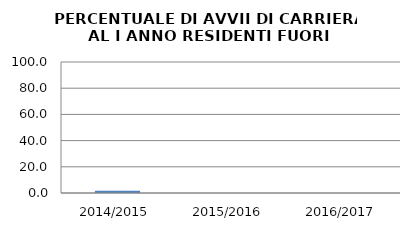
| Category | 2014/2015 2015/2016 2016/2017 |
|---|---|
| 2014/2015 | 1.786 |
| 2015/2016 | 0 |
| 2016/2017 | 0 |